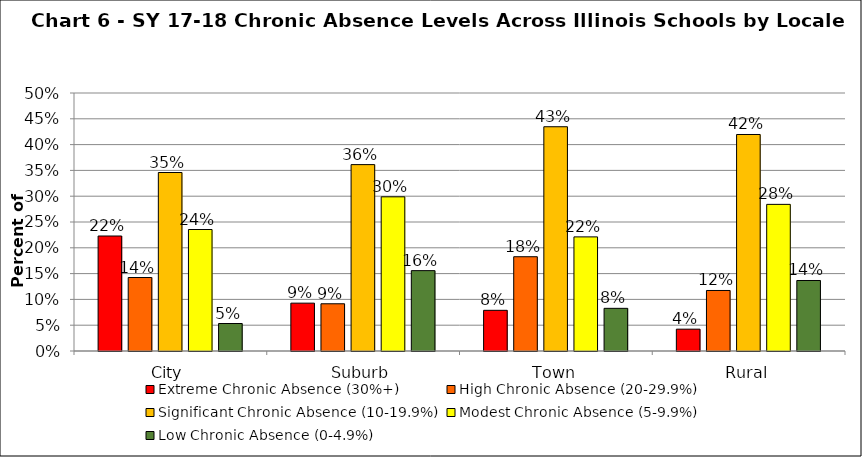
| Category | Extreme Chronic Absence (30%+) | High Chronic Absence (20-29.9%) | Significant Chronic Absence (10-19.9%) | Modest Chronic Absence (5-9.9%) | Low Chronic Absence (0-4.9%) |
|---|---|---|---|---|---|
| 0 | 0.223 | 0.142 | 0.346 | 0.235 | 0.053 |
| 1 | 0.093 | 0.092 | 0.361 | 0.299 | 0.156 |
| 2 | 0.079 | 0.183 | 0.435 | 0.221 | 0.083 |
| 3 | 0.042 | 0.117 | 0.42 | 0.284 | 0.137 |